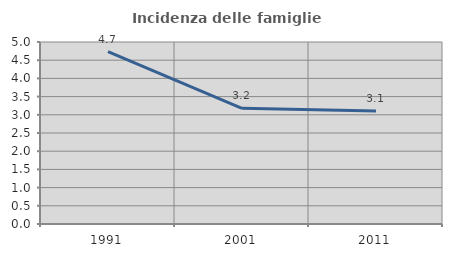
| Category | Incidenza delle famiglie numerose |
|---|---|
| 1991.0 | 4.734 |
| 2001.0 | 3.179 |
| 2011.0 | 3.107 |